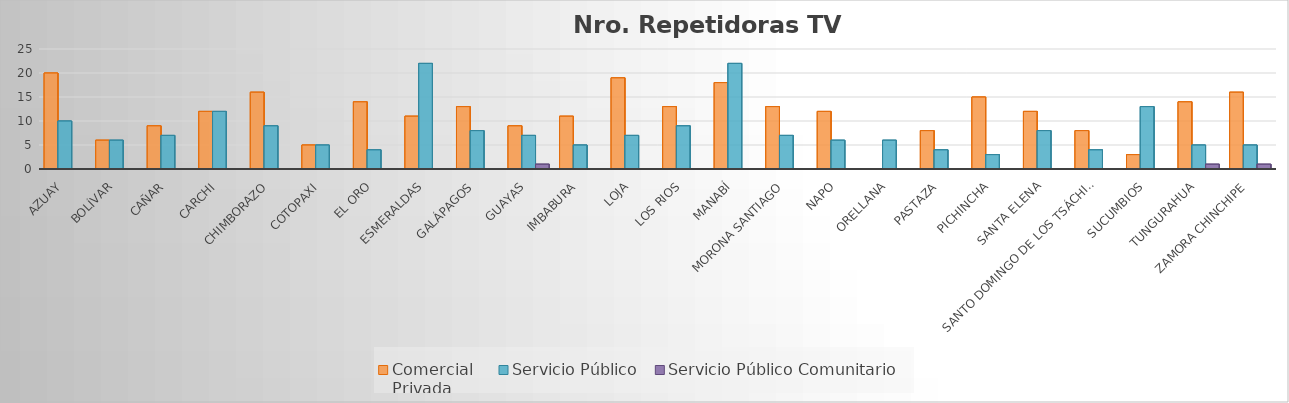
| Category | Comercial 
Privada | Servicio Público | Servicio Público Comunitario |
|---|---|---|---|
| Azuay | 20 | 10 | 0 |
| Bolívar | 6 | 6 | 0 |
| Cañar | 9 | 7 | 0 |
| Carchi | 12 | 12 | 0 |
| Chimborazo | 16 | 9 | 0 |
| Cotopaxi | 5 | 5 | 0 |
| El Oro | 14 | 4 | 0 |
| Esmeraldas | 11 | 22 | 0 |
| Galápagos | 13 | 8 | 0 |
| Guayas | 9 | 7 | 1 |
| Imbabura | 11 | 5 | 0 |
| Loja | 19 | 7 | 0 |
| Los Rios | 13 | 9 | 0 |
| Manabí | 18 | 22 | 0 |
| Morona Santiago | 13 | 7 | 0 |
| Napo | 12 | 6 | 0 |
| Orellana | 0 | 6 | 0 |
| Pastaza | 8 | 4 | 0 |
| Pichincha | 15 | 3 | 0 |
| Santa Elena | 12 | 8 | 0 |
| Santo Domingo de los Tsáchilas | 8 | 4 | 0 |
| Sucumbios | 3 | 13 | 0 |
| Tungurahua | 14 | 5 | 1 |
| Zamora Chinchipe | 16 | 5 | 1 |